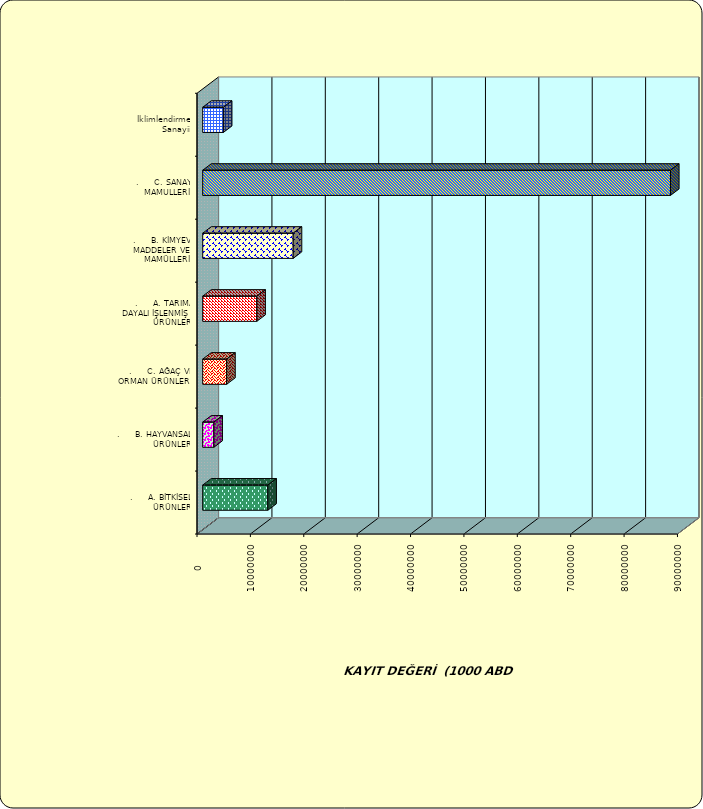
| Category | Series 0 |
|---|---|
| .     A. BİTKİSEL ÜRÜNLER | 12201256.781 |
| .     B. HAYVANSAL ÜRÜNLER | 2090045.052 |
| .     C. AĞAÇ VE ORMAN ÜRÜNLERİ | 4486598.063 |
| .     A. TARIMA DAYALI İŞLENMİŞ ÜRÜNLER | 10135284.434 |
| .     B. KİMYEVİ MADDELER VE MAMÜLLERİ | 16949747.132 |
| .     C. SANAYİ MAMULLERİ | 87625416.408 |
|  İklimlendirme Sanayii | 3869572.65 |